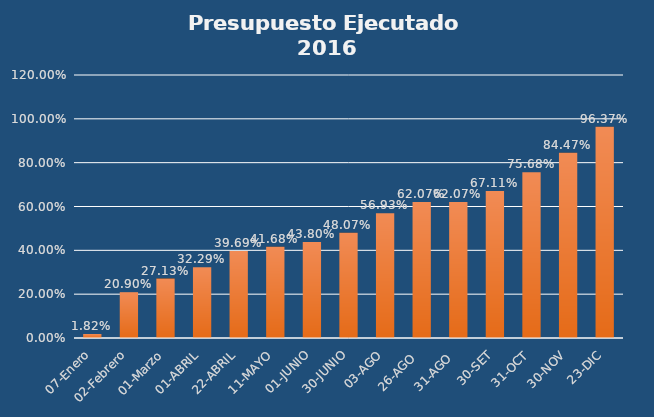
| Category | Presupuesto Ejecutado (solicitado + comprometido + rec.mercancía + devengado) |
|---|---|
| 07-Enero | 0.018 |
| 02-Febrero | 0.209 |
| 01-Marzo | 0.271 |
| 01-ABRIL | 0.323 |
| 22-ABRIL | 0.397 |
| 11-MAYO | 0.417 |
| 01-JUNIO | 0.438 |
| 30-JUNIO | 0.481 |
| 03-AGO | 0.569 |
| 26-AGO  | 0.621 |
| 31-AGO  | 0.621 |
| 30-SET | 0.671 |
| 31-OCT | 0.757 |
| 30-NOV | 0.845 |
| 23-DIC | 0.964 |